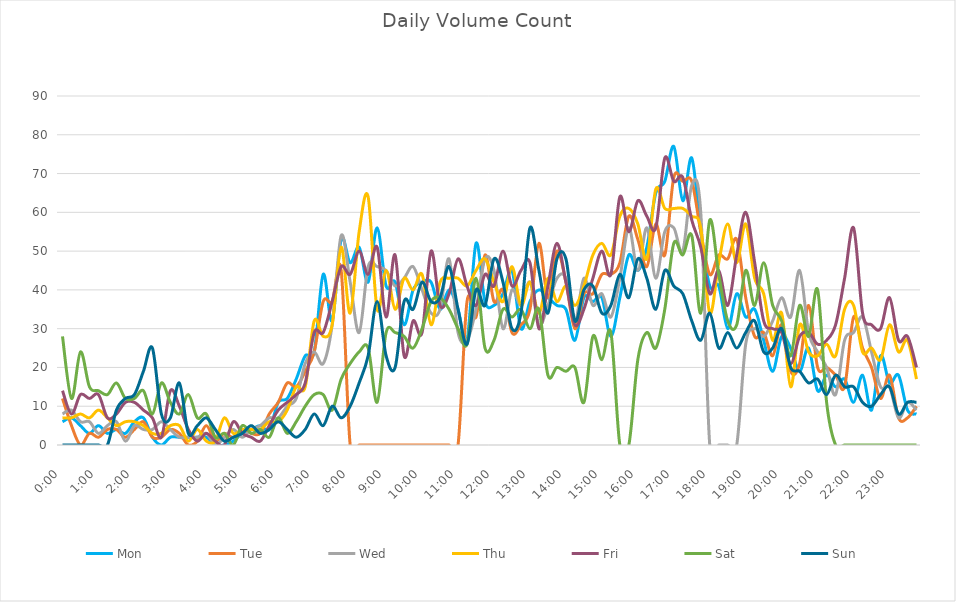
| Category | Mon | Tue | Wed | Thu | Fri | Sat | Sun |
|---|---|---|---|---|---|---|---|
| 0.0 | 6 | 12 | 8 | 7 | 14 | 28 | 0 |
| 0.010416666666666666 | 7 | 5 | 9 | 7 | 8 | 12 | 0 |
| 0.020833333333333332 | 5 | 0 | 6 | 8 | 13 | 24 | 0 |
| 0.03125 | 3 | 3 | 6 | 7 | 12 | 15 | 0 |
| 0.041666666666666664 | 5 | 2 | 3 | 9 | 13 | 14 | 0 |
| 0.05208333333333333 | 3 | 4 | 5 | 7 | 7 | 13 | 0 |
| 0.06249999999999999 | 4 | 4 | 6 | 5 | 8 | 16 | 9 |
| 0.07291666666666666 | 3 | 2 | 1 | 6 | 11 | 12 | 12 |
| 0.08333333333333333 | 6 | 4 | 5 | 6 | 11 | 12 | 13 |
| 0.09375 | 7 | 6 | 4 | 5 | 9 | 14 | 19 |
| 0.10416666666666667 | 2 | 2 | 4 | 3 | 7 | 8 | 25 |
| 0.11458333333333334 | 0 | 2 | 6 | 3 | 2 | 16 | 8 |
| 0.125 | 2 | 4 | 4 | 5 | 14 | 11 | 7 |
| 0.13541666666666666 | 2 | 3 | 2 | 5 | 10 | 8 | 16 |
| 0.14583333333333331 | 2 | 0 | 2 | 1 | 4 | 13 | 3 |
| 0.15624999999999997 | 2 | 1 | 2 | 4 | 1 | 7 | 5 |
| 0.16666666666666663 | 2 | 5 | 3 | 1 | 3 | 8 | 7 |
| 0.1770833333333333 | 0 | 1 | 0 | 1 | 1 | 2 | 4 |
| 0.18749999999999994 | 0 | 3 | 2 | 7 | 0 | 3 | 1 |
| 0.1979166666666666 | 1 | 2 | 4 | 3 | 6 | 0 | 2 |
| 0.20833333333333326 | 3 | 4 | 2 | 4 | 3 | 5 | 3 |
| 0.21874999999999992 | 4 | 3 | 4 | 4 | 2 | 3 | 5 |
| 0.22916666666666657 | 5 | 3 | 5 | 4 | 1 | 4 | 3 |
| 0.23958333333333323 | 4 | 8 | 7 | 6 | 5 | 2 | 4 |
| 0.2499999999999999 | 11 | 11 | 7 | 6 | 9 | 7 | 6 |
| 0.2604166666666666 | 12 | 16 | 10 | 9 | 11 | 3 | 4 |
| 0.27083333333333326 | 17 | 15 | 12 | 15 | 13 | 6 | 2 |
| 0.28124999999999994 | 23 | 19 | 21 | 15 | 16 | 10 | 4 |
| 0.29166666666666663 | 24 | 24 | 24 | 32 | 29 | 13 | 8 |
| 0.3020833333333333 | 44 | 37 | 21 | 28 | 29 | 13 | 5 |
| 0.3125 | 32 | 37 | 31 | 31 | 37 | 9 | 10 |
| 0.3229166666666667 | 53 | 45 | 54 | 51 | 46 | 17 | 7 |
| 0.33333333333333337 | 47 | 0 | 42 | 34 | 44 | 21 | 10 |
| 0.34375000000000006 | 51 | 0 | 29 | 55 | 50 | 24 | 16 |
| 0.35416666666666674 | 42 | 0 | 46 | 64 | 44 | 25 | 23 |
| 0.3645833333333334 | 56 | 0 | 46 | 35 | 51 | 11 | 37 |
| 0.3750000000000001 | 41 | 0 | 45 | 45 | 33 | 29 | 23 |
| 0.3854166666666668 | 42 | 0 | 41 | 35 | 49 | 29 | 20 |
| 0.3958333333333335 | 31 | 0 | 43 | 43 | 23 | 28 | 37 |
| 0.40625000000000017 | 40 | 0 | 46 | 40 | 32 | 25 | 35 |
| 0.41666666666666685 | 42 | 0 | 40 | 44 | 29 | 30 | 42 |
| 0.4270833333333333 | 42 | 0 | 34 | 31 | 50 | 37 | 37 |
| 0.4375000000000002 | 35 | 0 | 35 | 42 | 36 | 38 | 38 |
| 0.4479166666666669 | 40 | 0 | 48 | 43 | 39 | 35 | 46 |
| 0.4583333333333333 | 35 | 0 | 29 | 43 | 48 | 30 | 35 |
| 0.4687500000000003 | 27 | 37 | 27 | 41 | 41 | 26 | 26 |
| 0.47916666666666696 | 52 | 33 | 35 | 45 | 36 | 43 | 40 |
| 0.4895833333333333 | 37 | 49 | 48 | 48 | 44 | 25 | 36 |
| 0.5000000000000003 | 36 | 37 | 45 | 42 | 41 | 27 | 48 |
| 0.510416666666667 | 39 | 40 | 30 | 37 | 50 | 35 | 42 |
| 0.5208333333333334 | 45 | 29 | 40 | 46 | 41 | 33 | 30 |
| 0.5312500000000002 | 30 | 31 | 36 | 36 | 45 | 35 | 34 |
| 0.5416666666666669 | 37 | 35 | 42 | 42 | 47 | 30 | 56 |
| 0.5520833333333335 | 40 | 52 | 31 | 34 | 30 | 35 | 45 |
| 0.5625000000000001 | 38 | 38 | 36 | 43 | 41 | 18 | 34 |
| 0.5729166666666667 | 36 | 50 | 43 | 37 | 52 | 20 | 48 |
| 0.5833333333333334 | 35 | 42 | 43 | 41 | 42 | 19 | 48 |
| 0.59375 | 27 | 30 | 32 | 36 | 31 | 20 | 32 |
| 0.6041666666666666 | 38 | 39 | 43 | 41 | 35 | 11 | 40 |
| 0.6145833333333333 | 37 | 39 | 36 | 49 | 43 | 28 | 41 |
| 0.6249999999999999 | 38 | 44 | 39 | 52 | 50 | 22 | 34 |
| 0.6354166666666665 | 28 | 44 | 33 | 49 | 44 | 29 | 36 |
| 0.6458333333333331 | 38 | 47 | 43 | 59 | 64 | 0 | 44 |
| 0.6562499999999998 | 49 | 59 | 56 | 61 | 55 | 0 | 38 |
| 0.6666666666666666 | 45 | 53 | 45 | 57 | 63 | 22 | 48 |
| 0.677083333333333 | 51 | 46 | 56 | 48 | 59 | 29 | 43 |
| 0.6874999999999997 | 65 | 57 | 43 | 66 | 56 | 25 | 35 |
| 0.6979166666666666 | 68 | 49 | 55 | 61 | 74 | 35 | 45 |
| 0.7083333333333329 | 77 | 69 | 56 | 61 | 68 | 52 | 41 |
| 0.7187499999999996 | 63 | 68 | 50 | 61 | 69 | 49 | 39 |
| 0.7291666666666666 | 74 | 68 | 67 | 59 | 58 | 54 | 32 |
| 0.7395833333333328 | 55 | 55 | 60 | 56 | 51 | 34 | 27 |
| 0.75 | 41 | 44 | 0 | 34 | 39 | 58 | 34 |
| 0.7604166666666666 | 41 | 49 | 0 | 47 | 45 | 44 | 25 |
| 0.7708333333333327 | 30 | 48 | 0 | 57 | 36 | 32 | 29 |
| 0.78125 | 39 | 53 | 0 | 47 | 49 | 31 | 25 |
| 0.7916666666666666 | 33 | 38 | 26 | 57 | 60 | 45 | 29 |
| 0.8020833333333326 | 35 | 28 | 30 | 43 | 47 | 36 | 32 |
| 0.8125 | 27 | 29 | 28 | 39 | 32 | 47 | 24 |
| 0.8229166666666666 | 19 | 23 | 32 | 27 | 30 | 36 | 25 |
| 0.8333333333333334 | 28 | 31 | 38 | 34 | 29 | 32 | 30 |
| 0.84375 | 25 | 19 | 33 | 15 | 21 | 23 | 20 |
| 0.8541666666666666 | 19 | 21 | 45 | 31 | 28 | 36 | 19 |
| 0.8645833333333334 | 25 | 36 | 29 | 24 | 29 | 28 | 16 |
| 0.875 | 14 | 20 | 24 | 23 | 26 | 40 | 17 |
| 0.8854166666666666 | 18 | 20 | 20 | 26 | 27 | 11 | 13 |
| 0.8958333333333334 | 15 | 18 | 13 | 23 | 31 | 0 | 18 |
| 0.90625 | 17 | 15 | 27 | 35 | 43 | 0 | 15 |
| 0.9166666666666666 | 11 | 33 | 29 | 36 | 56 | 0 | 15 |
| 0.9270833333333334 | 18 | 25 | 33 | 24 | 34 | 0 | 11 |
| 0.9375 | 9 | 20 | 24 | 25 | 31 | 0 | 10 |
| 0.9479166666666666 | 23 | 12 | 15 | 22 | 30 | 0 | 13 |
| 0.9583333333333334 | 16 | 18 | 15 | 31 | 38 | 0 | 15 |
| 0.96875 | 18 | 7 | 7 | 24 | 27 | 0 | 8 |
| 0.9791666666666666 | 9 | 7 | 11 | 27 | 28 | 0 | 11 |
| 0.9895833333333334 | 8 | 10 | 9 | 17 | 20 | 0 | 11 |